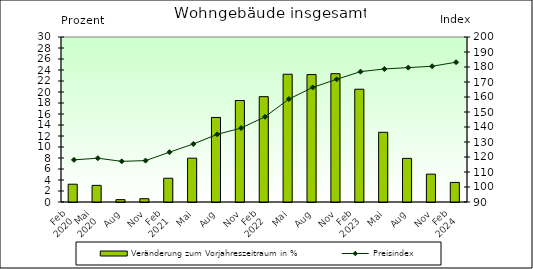
| Category | Veränderung zum Vorjahreszeitraum in % |
|---|---|
| 0 | 3.234 |
| 1 | 3.025 |
| 2 | 0.429 |
| 3 | 0.599 |
| 4 | 4.318 |
| 5 | 7.97 |
| 6 | 15.371 |
| 7 | 18.452 |
| 8 | 19.156 |
| 9 | 23.232 |
| 10 | 23.168 |
| 11 | 23.331 |
| 12 | 20.504 |
| 13 | 12.673 |
| 14 | 7.933 |
| 15 | 5.064 |
| 16 | 3.561 |